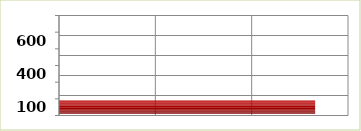
| Category | Series 0 |
|---|---|
| 100.0 | 26588113 |
| 200.0 | 0 |
| 400.0 | 0 |
| 500.0 | 0 |
| 600.0 | 0 |
| 700.0 | 0 |